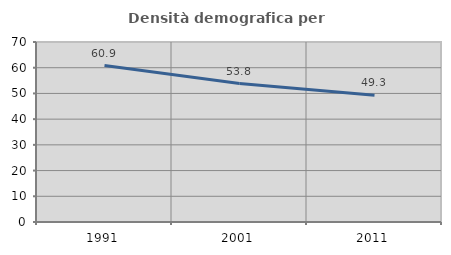
| Category | Densità demografica |
|---|---|
| 1991.0 | 60.85 |
| 2001.0 | 53.828 |
| 2011.0 | 49.252 |